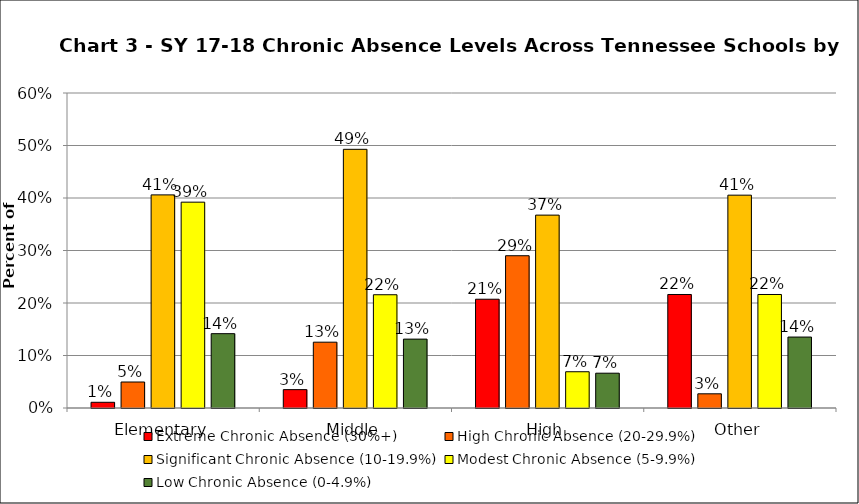
| Category | Extreme Chronic Absence (30%+) | High Chronic Absence (20-29.9%) | Significant Chronic Absence (10-19.9%) | Modest Chronic Absence (5-9.9%) | Low Chronic Absence (0-4.9%) |
|---|---|---|---|---|---|
| 0 | 0.011 | 0.05 | 0.406 | 0.392 | 0.142 |
| 1 | 0.035 | 0.125 | 0.493 | 0.216 | 0.131 |
| 2 | 0.207 | 0.29 | 0.367 | 0.069 | 0.066 |
| 3 | 0.216 | 0.027 | 0.405 | 0.216 | 0.135 |